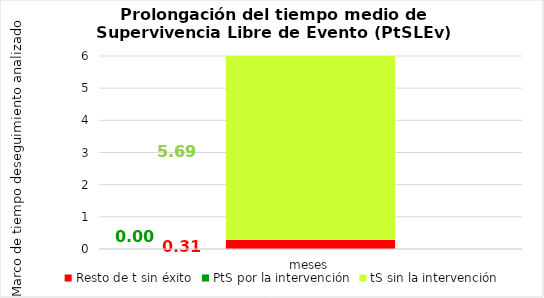
| Category | Resto de t sin éxito | PtS por la intervención | tS sin la intervención |
|---|---|---|---|
| meses | 0.31 | 0 | 5.69 |